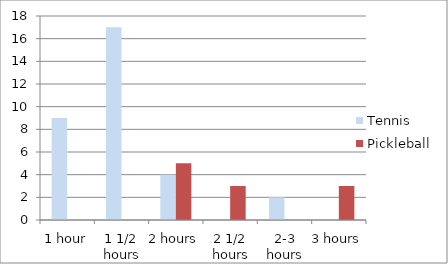
| Category | Tennis | Pickleball |
|---|---|---|
| 1 hour | 9 | 0 |
| 1 1/2 hours | 17 | 0 |
| 2 hours | 4 | 5 |
| 2 1/2 hours | 0 | 3 |
| 2-3 hours | 2 | 0 |
| 3 hours | 0 | 3 |